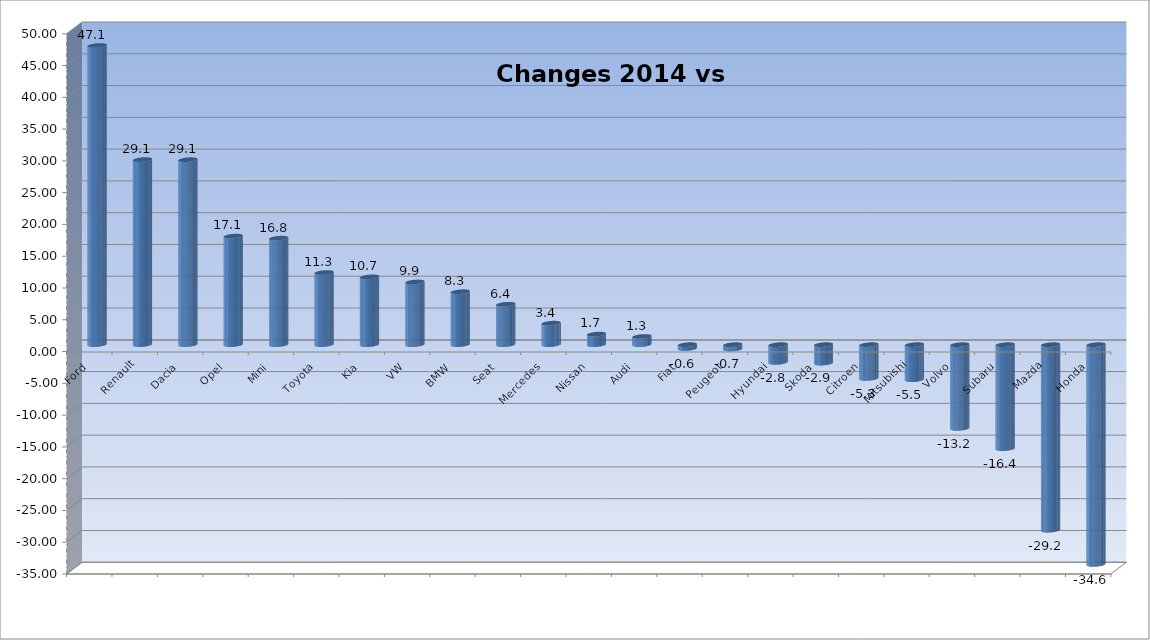
| Category | Ytd 2015 |
|---|---|
| Ford | 47.066 |
| Renault | 29.119 |
| Dacia | 29.102 |
| Opel | 17.073 |
| Mini | 16.754 |
| Toyota | 11.348 |
| Kia | 10.671 |
| VW | 9.863 |
| BMW | 8.329 |
| Seat | 6.356 |
| Mercedes | 3.378 |
| Nissan | 1.657 |
| Audi | 1.285 |
| Fiat | -0.615 |
| Peugeot | -0.703 |
| Hyundai | -2.795 |
| Skoda | -2.908 |
| Citroen | -5.317 |
| Mitsubishi | -5.524 |
| Volvo | -13.183 |
| Subaru | -16.367 |
| Mazda | -29.206 |
| Honda | -34.582 |